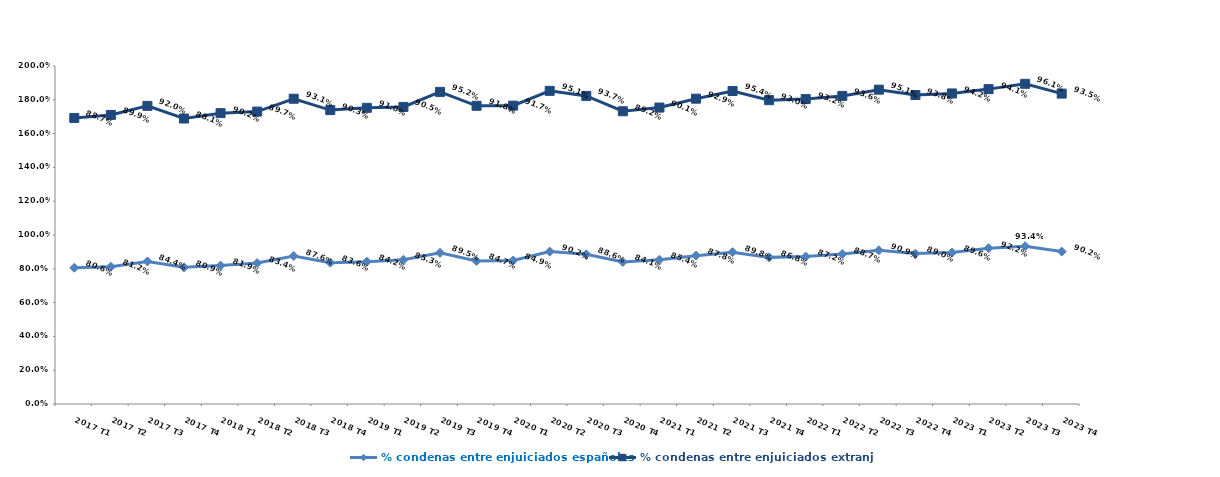
| Category | % condenas entre enjuiciados españoles | % condenas entre enjuiciados extranjeros |
|---|---|---|
| 2017 T1 | 0.806 | 0.887 |
| 2017 T2 | 0.812 | 0.899 |
| 2017 T3 | 0.844 | 0.92 |
| 2017 T4 | 0.809 | 0.881 |
| 2018 T1 | 0.819 | 0.902 |
| 2018 T2 | 0.834 | 0.897 |
| 2018 T3 | 0.876 | 0.931 |
| 2018 T4 | 0.836 | 0.903 |
| 2019 T1 | 0.842 | 0.91 |
| 2019 T2 | 0.853 | 0.905 |
| 2019 T3 | 0.895 | 0.952 |
| 2019 T4 | 0.847 | 0.918 |
| 2020 T1 | 0.849 | 0.917 |
| 2020 T2 | 0.902 | 0.951 |
| 2020 T3 | 0.886 | 0.937 |
| 2020 T4 | 0.841 | 0.892 |
| 2021 T1 | 0.854 | 0.901 |
| 2021 T2 | 0.878 | 0.929 |
| 2021 T3 | 0.898 | 0.954 |
| 2021 T4 | 0.868 | 0.93 |
| 2022 T1 | 0.872 | 0.932 |
| 2022 T2 | 0.887 | 0.936 |
| 2022 T3 | 0.909 | 0.951 |
| 2022 T4 | 0.89 | 0.938 |
| 2023 T1 | 0.896 | 0.942 |
| 2023 T2 | 0.922 | 0.941 |
| 2023 T3 | 0.934 | 0.961 |
| 2023 T4 | 0.902 | 0.935 |